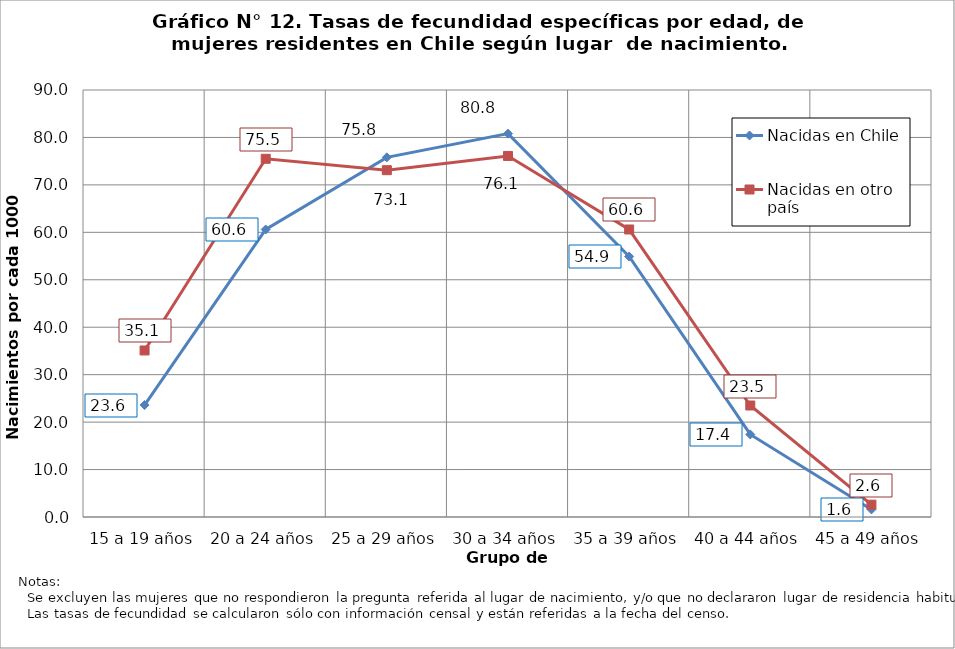
| Category | Nacidas en Chile | Nacidas en otro país |
|---|---|---|
| 15 a 19 años | 23.6 | 35.1 |
| 20 a 24 años | 60.6 | 75.5 |
| 25 a 29 años | 75.8 | 73.1 |
| 30 a 34 años | 80.8 | 76.1 |
| 35 a 39 años | 54.9 | 60.6 |
| 40 a 44 años | 17.4 | 23.5 |
| 45 a 49 años | 1.6 | 2.6 |